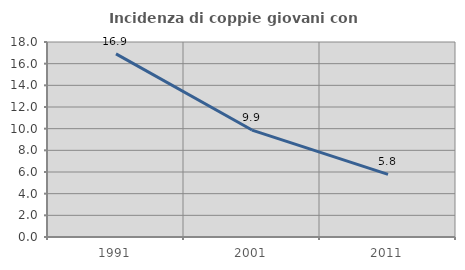
| Category | Incidenza di coppie giovani con figli |
|---|---|
| 1991.0 | 16.908 |
| 2001.0 | 9.872 |
| 2011.0 | 5.775 |